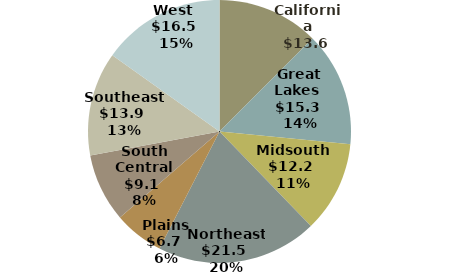
| Category | Series 0 |
|---|---|
| California | 13.611 |
| Great Lakes  | 15.308 |
| Midsouth  | 12.217 |
| Northeast  | 21.521 |
| Plains  | 6.677 |
| South Central  | 9.141 |
| Southeast  | 13.899 |
| West  | 16.514 |